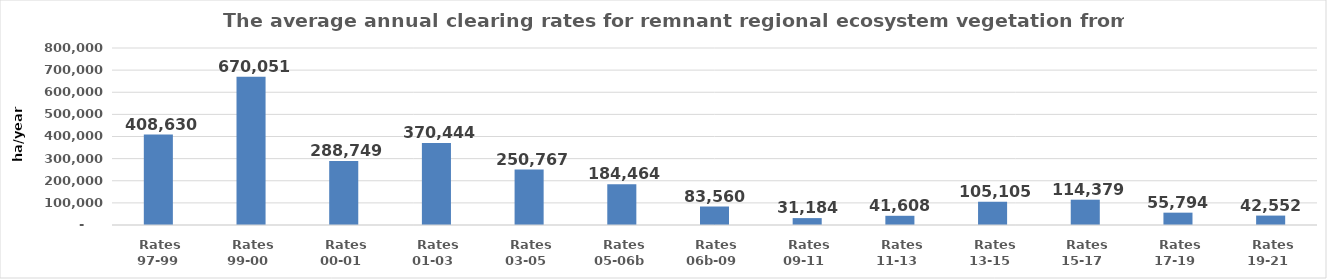
| Category | Series 0 |
|---|---|
|  Rates 97-99 | 408630.201 |
|  Rates 99-00  | 670050.84 |
|  Rates 00-01  | 288749.227 |
|  Rates 01-03  | 370444.335 |
|  Rates 03-05  | 250766.805 |
|  Rates 05-06b  | 184464.125 |
|  Rates 06b-09  | 83560.439 |
|  Rates 09-11  | 31184.211 |
|  Rates 11-13  | 41607.962 |
|  Rates 13-15  | 105105.298 |
|  Rates 15-17  | 114378.567 |
|  Rates 17-19  | 55794.095 |
|  Rates 19-21  | 42551.828 |